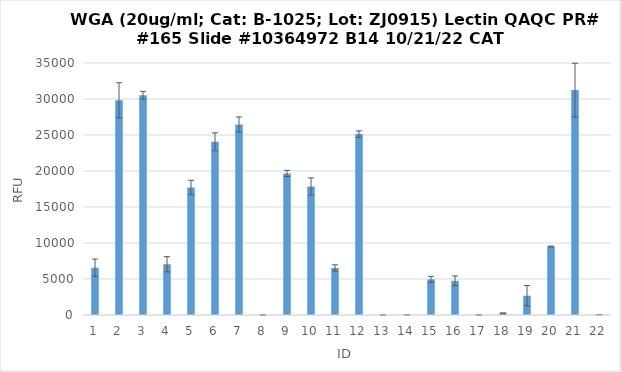
| Category | RFU |
|---|---|
| 0 | 6563.75 |
| 1 | 29820.75 |
| 2 | 30529.75 |
| 3 | 7050 |
| 4 | 17706 |
| 5 | 24056.5 |
| 6 | 26462.75 |
| 7 | 1.25 |
| 8 | 19660.5 |
| 9 | 17848 |
| 10 | 6530.25 |
| 11 | 25124.75 |
| 12 | 1 |
| 13 | 22.75 |
| 14 | 4954.25 |
| 15 | 4746.5 |
| 16 | 7.5 |
| 17 | 262.5 |
| 18 | 2686 |
| 19 | 9508.25 |
| 20 | 31232.75 |
| 21 | 43 |